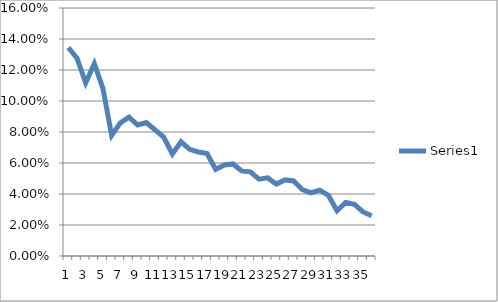
| Category | Series 0 |
|---|---|
| 0 | 0.134 |
| 1 | 0.128 |
| 2 | 0.112 |
| 3 | 0.124 |
| 4 | 0.108 |
| 5 | 0.078 |
| 6 | 0.086 |
| 7 | 0.09 |
| 8 | 0.084 |
| 9 | 0.086 |
| 10 | 0.081 |
| 11 | 0.077 |
| 12 | 0.066 |
| 13 | 0.074 |
| 14 | 0.069 |
| 15 | 0.067 |
| 16 | 0.066 |
| 17 | 0.056 |
| 18 | 0.059 |
| 19 | 0.059 |
| 20 | 0.055 |
| 21 | 0.054 |
| 22 | 0.05 |
| 23 | 0.05 |
| 24 | 0.046 |
| 25 | 0.049 |
| 26 | 0.048 |
| 27 | 0.043 |
| 28 | 0.041 |
| 29 | 0.042 |
| 30 | 0.039 |
| 31 | 0.029 |
| 32 | 0.034 |
| 33 | 0.033 |
| 34 | 0.028 |
| 35 | 0.026 |